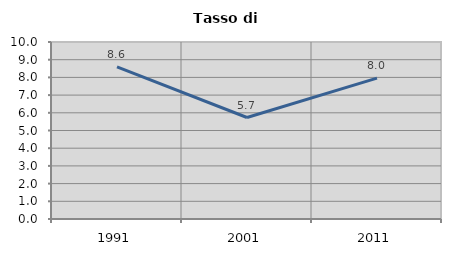
| Category | Tasso di disoccupazione   |
|---|---|
| 1991.0 | 8.59 |
| 2001.0 | 5.734 |
| 2011.0 | 7.96 |